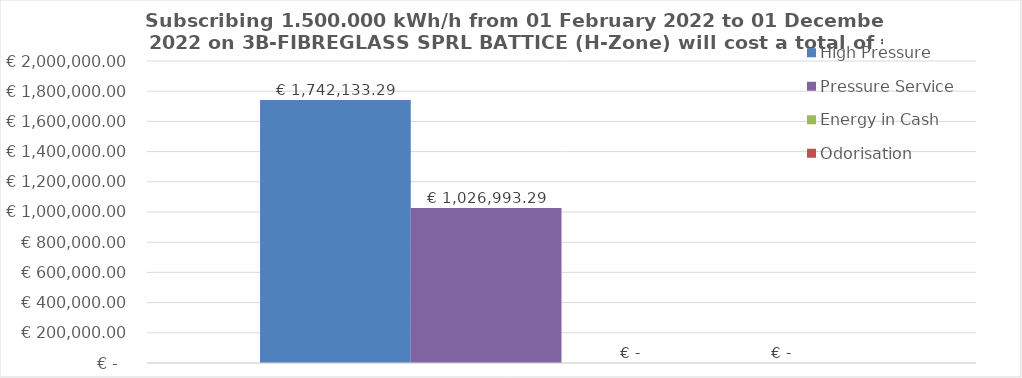
| Category | High Pressure | Pressure Service | Energy in Cash  | Odorisation |
|---|---|---|---|---|
|  | 1742133.288 | 1026993.288 | 0 | 0 |